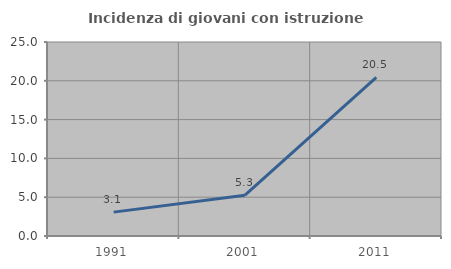
| Category | Incidenza di giovani con istruzione universitaria |
|---|---|
| 1991.0 | 3.077 |
| 2001.0 | 5.263 |
| 2011.0 | 20.455 |